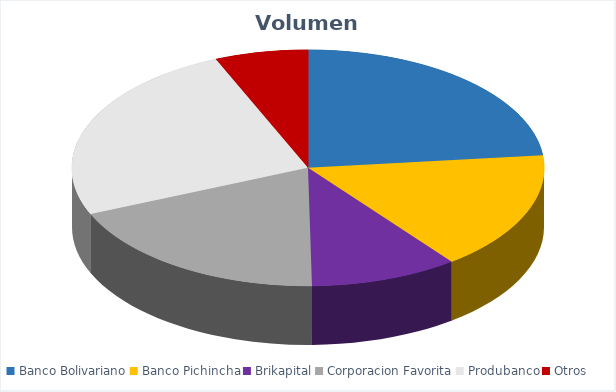
| Category | VOLUMEN ($USD) |
|---|---|
| Banco Bolivariano | 18400 |
| Banco Pichincha | 12905 |
| Brikapital | 8000 |
| Corporacion Favorita | 14909.93 |
| Produbanco | 19775 |
| Otros | 5040.88 |